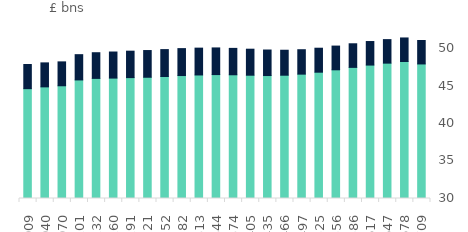
| Category | domestic | international |
|---|---|---|
| 2017-10-01 | 44645.802 | 3217.533 |
| 2017-11-01 | 44884.239 | 3198.519 |
| 2017-12-01 | 45030.711 | 3186.105 |
| 2018-01-01 | 45809.428 | 3368.599 |
| 2018-02-01 | 46013.463 | 3424.279 |
| 2018-03-01 | 46054.562 | 3477.09 |
| 2018-04-01 | 46118.493 | 3524.487 |
| 2018-05-01 | 46164.882 | 3563.09 |
| 2018-06-01 | 46266.074 | 3587.181 |
| 2018-07-01 | 46394.997 | 3589.917 |
| 2018-08-01 | 46471.466 | 3576.654 |
| 2018-09-01 | 46522.829 | 3553.312 |
| 2018-10-01 | 46497.484 | 3517.717 |
| 2018-11-01 | 46438.507 | 3468.075 |
| 2018-12-01 | 46394.529 | 3403.955 |
| 2019-01-01 | 46438.351 | 3329.053 |
| 2019-02-01 | 46581.521 | 3255.712 |
| 2019-03-01 | 46840.594 | 3197.569 |
| 2019-04-01 | 47159.751 | 3162.714 |
| 2019-05-01 | 47482.698 | 3147 |
| 2019-06-01 | 47790.001 | 3139.486 |
| 2019-07-01 | 48047.601 | 3136.738 |
| 2019-08-01 | 48266.594 | 3139.339 |
| 2019-09-01 | 47939.971 | 3126.084 |